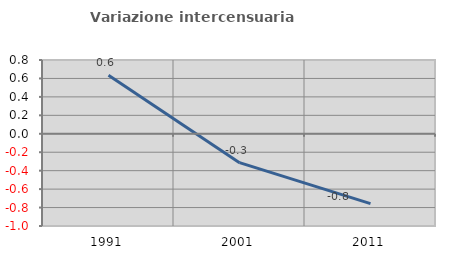
| Category | Variazione intercensuaria annua |
|---|---|
| 1991.0 | 0.634 |
| 2001.0 | -0.313 |
| 2011.0 | -0.758 |